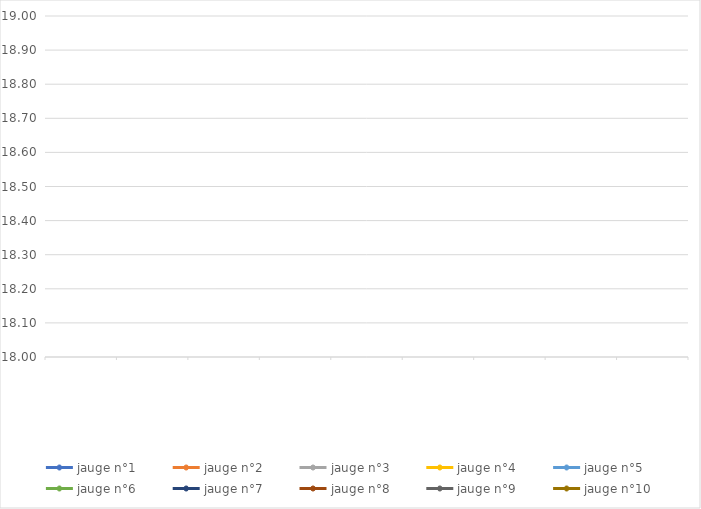
| Category | jauge n°1 | jauge n°2 | jauge n°3 | jauge n°4 | jauge n°5 | jauge n°6 | jauge n°7 | jauge n°8 | jauge n°9 | jauge n°10 |
|---|---|---|---|---|---|---|---|---|---|---|
|  | 0 | 0 | 0 | 0 | 0 | 0 | 0 | 0 | 0 | 0 |
|  | 0 | 0 | 0 | 0 | 0 | 0 | 0 | 0 | 0 | 0 |
|  | 0 | 0 | 0 | 0 | 0 | 0 | 0 | 0 | 0 | 0 |
|  | 0 | 0 | 0 | 0 | 0 | 0 | 0 | 0 | 0 | 0 |
|  | 0 | 0 | 0 | 0 | 0 | 0 | 0 | 0 | 0 | 0 |
|  | 0 | 0 | 0 | 0 | 0 | 0 | 0 | 0 | 0 | 0 |
|  | 0 | 0 | 0 | 0 | 0 | 0 | 0 | 0 | 0 | 0 |
|  | 0 | 0 | 0 | 0 | 0 | 0 | 0 | 0 | 0 | 0 |
|  | 0 | 0 | 0 | 0 | 0 | 0 | 0 | 0 | 0 | 0 |